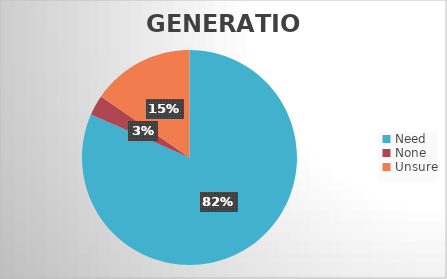
| Category | Series 0 |
|---|---|
| Need | 53 |
| None | 2 |
| Unsure | 10 |